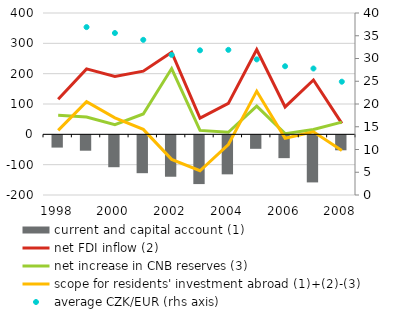
| Category | current and capital account (1) |
|---|---|
| 1998.0 | -40.4 |
| 1999.0 | -50.7 |
| 2000.0 | -105.1 |
| 2001.0 | -124.8 |
| 2002.0 | -136.5 |
| 2003.0 | -160.7 |
| 2004.0 | -128.6 |
| 2005.0 | -44.4 |
| 2006.0 | -75.2 |
| 2007.0 | -155.2 |
| 2008.0 | -49.3 |